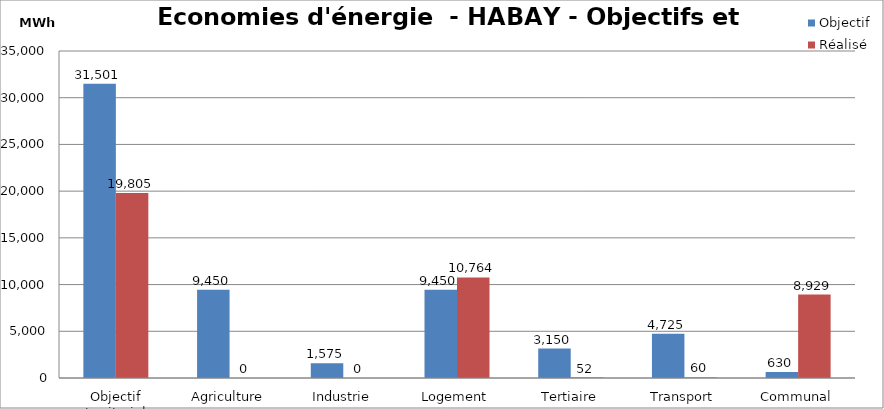
| Category | Objectif | Réalisé |
|---|---|---|
| Objectif territorial | 31501.109 | 19804.536 |
| Agriculture | 9450.333 | 0 |
| Industrie | 1575.055 | 0 |
| Logement | 9450.333 | 10763.676 |
| Tertiaire | 3150.111 | 52.2 |
| Transport | 4725.166 | 59.915 |
| Communal | 630.022 | 8928.744 |